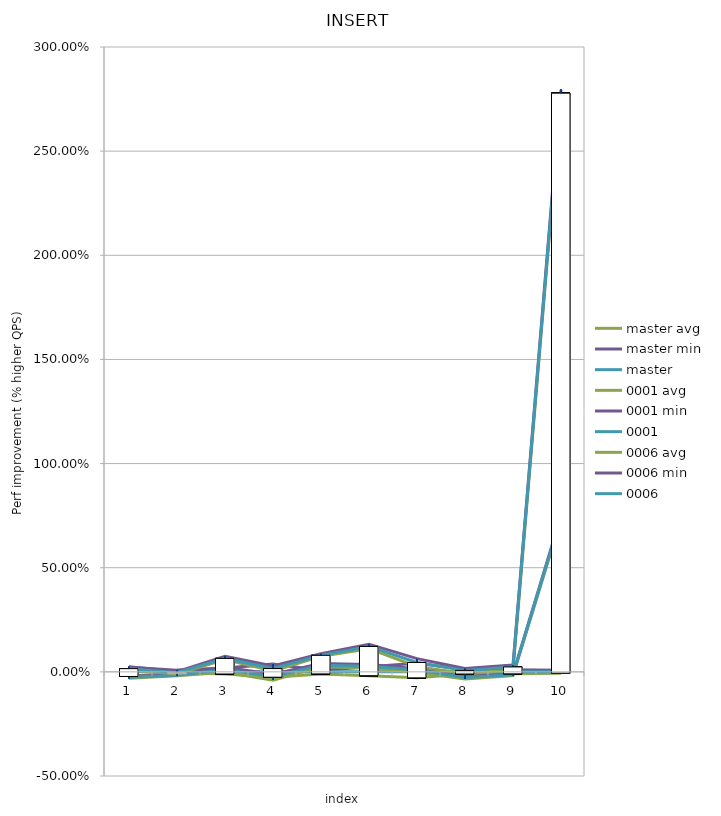
| Category | avg | master min | master | 0001 min | 0001 | 0006 min | 0006 |
|---|---|---|---|---|---|---|---|
| 0 | 0.01 | 0.022 | 0 | -0.021 | -0.026 | 0.024 | 0.015 |
| 1 | -0.01 | 0.008 | 0 | -0.014 | -0.017 | 0.001 | -0.004 |
| 2 | 0.059 | 0.018 | 0 | 0.022 | 0.011 | 0.075 | 0.065 |
| 3 | 0.005 | 0.037 | 0 | -0.012 | -0.023 | 0.028 | 0.016 |
| 4 | 0.075 | 0.007 | 0 | 0.041 | 0.031 | 0.087 | 0.079 |
| 5 | 0.111 | 0.025 | 0 | 0.035 | 0.027 | 0.133 | 0.122 |
| 6 | 0.025 | 0.041 | 0 | 0.015 | 0.009 | 0.063 | 0.045 |
| 7 | -0.008 | 0.011 | 0 | -0.022 | -0.027 | 0.017 | 0.007 |
| 8 | 0.008 | 0.01 | 0 | -0.011 | -0.014 | 0.033 | 0.024 |
| 9 | 2.764 | 0.008 | 0 | 0.749 | 0.741 | 2.795 | 2.779 |